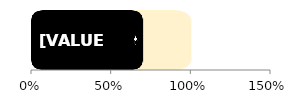
| Category | Total | Male |
|---|---|---|
| 0 | 1 | 0.697 |